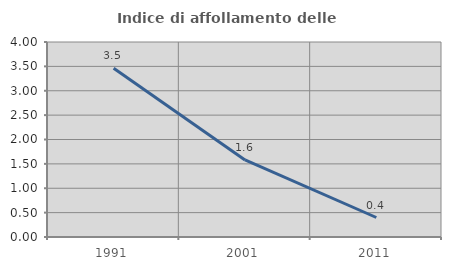
| Category | Indice di affollamento delle abitazioni  |
|---|---|
| 1991.0 | 3.463 |
| 2001.0 | 1.581 |
| 2011.0 | 0.4 |